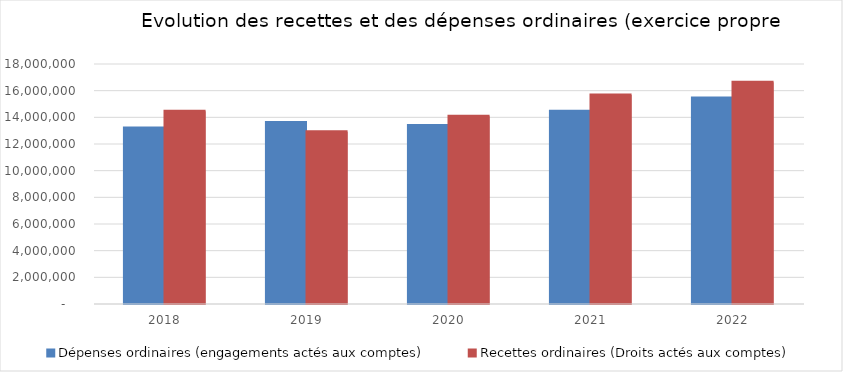
| Category | Dépenses ordinaires (engagements actés aux comptes) | Recettes ordinaires (Droits actés aux comptes) |
|---|---|---|
| 2018.0 | 13194803.81 | 14453243.89 |
| 2019.0 | 13603515.29 | 12911626.01 |
| 2020.0 | 13378943.38 | 14083303.42 |
| 2021.0 | 14451701.67 | 15683185.48 |
| 2022.0 | 15442766.28 | 16628257.72 |